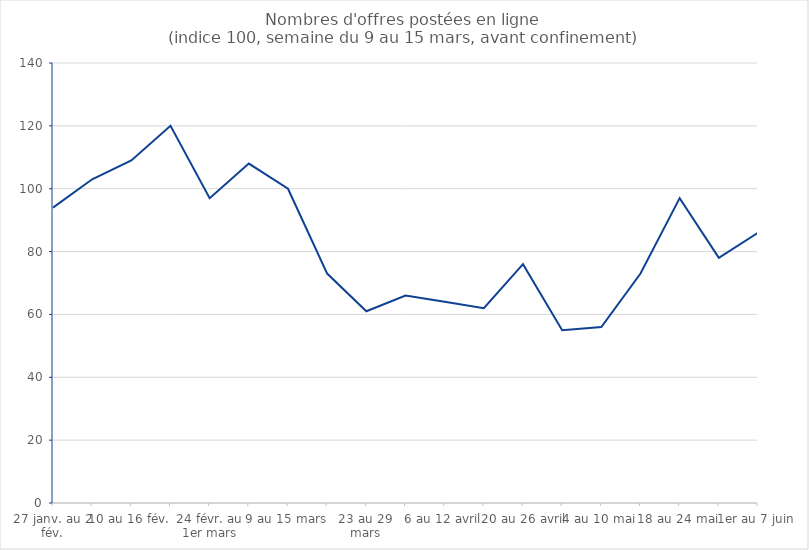
| Category | Series 0 |
|---|---|
| 27 janv. au 2 fév. | 94 |
| 3 au 9 fév. | 103 |
| 10 au 16 fév. | 109 |
| 17 au 23 fév. | 120 |
| 24 févr. au 1er mars | 97 |
| 2 au 8 mars | 108 |
| 9 au 15 mars | 100 |
| 16 au 22 mars | 73 |
| 23 au 29 mars | 61 |
| 30 mars au 5 avril | 66 |
| 6 au 12 avril | 64 |
| 13 au 19 avril | 62 |
| 20 au 26 avril | 76 |
| 27 avril au 3 mai | 55 |
| 4 au 10 mai | 56 |
| 11 au 17 mai | 73 |
| 18 au 24 mai | 97 |
| 25 au 31 mai | 78 |
| 1er au 7 juin | 86 |